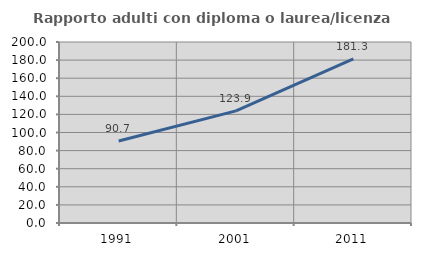
| Category | Rapporto adulti con diploma o laurea/licenza media  |
|---|---|
| 1991.0 | 90.667 |
| 2001.0 | 123.864 |
| 2011.0 | 181.333 |